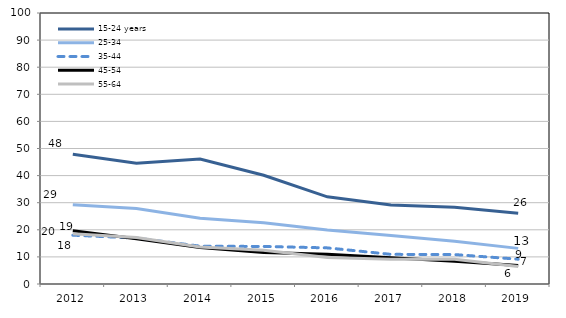
| Category | 15-24 years | 25-34  | 35-44  | 45-54  | 55-64  |
|---|---|---|---|---|---|
| 2012.0 | 47.872 | 29.25 | 18.014 | 19.644 | 18.546 |
| 2013.0 | 44.603 | 27.852 | 16.938 | 16.673 | 17.173 |
| 2014.0 | 46.121 | 24.266 | 13.964 | 13.482 | 13.659 |
| 2015.0 | 40.117 | 22.601 | 13.847 | 11.656 | 12.475 |
| 2016.0 | 32.176 | 19.913 | 13.329 | 11.02 | 9.758 |
| 2017.0 | 29.181 | 17.91 | 10.943 | 9.666 | 9.089 |
| 2018.0 | 28.311 | 15.763 | 10.862 | 8.388 | 9.13 |
| 2019.0 | 26.097 | 13.142 | 9.157 | 6.864 | 6.441 |